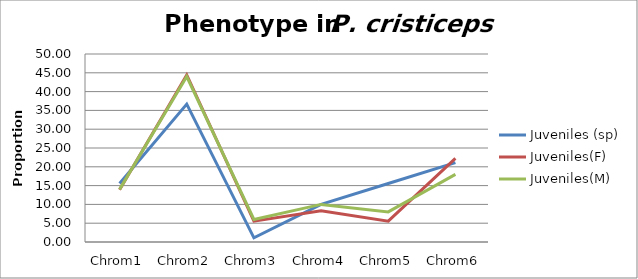
| Category | Juveniles (sp) | Juveniles(F)  | Juveniles(M) |
|---|---|---|---|
| Chrom1 | 15.556 | 13.889 | 14 |
| Chrom2 | 36.667 | 44.444 | 44 |
| Chrom3 | 1.111 | 5.556 | 6 |
| Chrom4 | 10 | 8.333 | 10 |
| Chrom5 | 15.556 | 5.556 | 8 |
| Chrom6 | 21.111 | 22.222 | 18 |